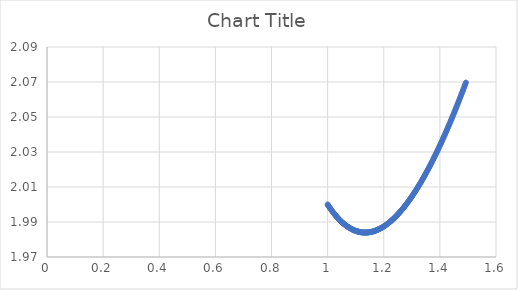
| Category | Series 0 |
|---|---|
| 1.0 | 2 |
| 1.0020008759583676 | 2 |
| 1.0040035076672138 | 1.999 |
| 1.0060079008777842 | 1.999 |
| 1.008014061342177 | 1.998 |
| 1.0100219948133655 | 1.998 |
| 1.0120317070452187 | 1.997 |
| 1.0140432037925207 | 1.997 |
| 1.016056490810993 | 1.996 |
| 1.018071573857315 | 1.996 |
| 1.020088458689142 | 1.995 |
| 1.0221071510651307 | 1.995 |
| 1.0241276567449544 | 1.995 |
| 1.0261499814893276 | 1.994 |
| 1.028174131060024 | 1.994 |
| 1.030200111219899 | 1.993 |
| 1.0322279277329087 | 1.993 |
| 1.0342575863641317 | 1.993 |
| 1.036289092879788 | 1.992 |
| 1.0383224530472612 | 1.992 |
| 1.0403576726351174 | 1.992 |
| 1.0423947574131265 | 1.991 |
| 1.0444337131522834 | 1.991 |
| 1.046474545624826 | 1.991 |
| 1.048517260604258 | 1.99 |
| 1.0505618638653689 | 1.99 |
| 1.052608361184252 | 1.99 |
| 1.0546567583383286 | 1.989 |
| 1.0567070611063651 | 1.989 |
| 1.058759275268495 | 1.989 |
| 1.0608134066062376 | 1.989 |
| 1.0628694609025209 | 1.988 |
| 1.0649274439417 | 1.988 |
| 1.0669873615095768 | 1.988 |
| 1.0690492193934225 | 1.988 |
| 1.0711130233819948 | 1.987 |
| 1.0731787792655616 | 1.987 |
| 1.0752464928359178 | 1.987 |
| 1.0773161698864087 | 1.987 |
| 1.0793878162119466 | 1.986 |
| 1.0814614376090346 | 1.986 |
| 1.083537039875784 | 1.986 |
| 1.0856146288119357 | 1.986 |
| 1.0876942102188798 | 1.986 |
| 1.0897757898996765 | 1.986 |
| 1.0918593736590754 | 1.985 |
| 1.0939449673035357 | 1.985 |
| 1.0960325766412462 | 1.985 |
| 1.0981222074821457 | 1.985 |
| 1.1002138656379428 | 1.985 |
| 1.1023075569221361 | 1.985 |
| 1.1044032871500338 | 1.985 |
| 1.1065010621387734 | 1.985 |
| 1.1086008877073432 | 1.985 |
| 1.1107027696766012 | 1.984 |
| 1.112806713869294 | 1.984 |
| 1.1149127261100789 | 1.984 |
| 1.117020812225542 | 1.984 |
| 1.1191309780442198 | 1.984 |
| 1.1212432293966175 | 1.984 |
| 1.1233575721152296 | 1.984 |
| 1.1254740120345597 | 1.984 |
| 1.1275925549911405 | 1.984 |
| 1.129713206823554 | 1.984 |
| 1.1318359733724501 | 1.984 |
| 1.133960860480567 | 1.984 |
| 1.1360878739927527 | 1.984 |
| 1.1382170197559816 | 1.984 |
| 1.1403483036193771 | 1.984 |
| 1.1424817314342297 | 1.984 |
| 1.1446173090540175 | 1.984 |
| 1.146755042334426 | 1.984 |
| 1.1488949371333672 | 1.984 |
| 1.151036999311 | 1.984 |
| 1.15318123472975 | 1.984 |
| 1.155327649254328 | 1.984 |
| 1.157476248751752 | 1.984 |
| 1.159627039091364 | 1.985 |
| 1.1617800261448519 | 1.985 |
| 1.1639352157862684 | 1.985 |
| 1.16609261389205 | 1.985 |
| 1.1682522263410384 | 1.985 |
| 1.1704140590144985 | 1.985 |
| 1.1725781177961385 | 1.985 |
| 1.17474440857213 | 1.985 |
| 1.1769129372311256 | 1.985 |
| 1.1790837096642823 | 1.986 |
| 1.1812567317652773 | 1.986 |
| 1.1834320094303297 | 1.986 |
| 1.1856095485582197 | 1.986 |
| 1.187789355050307 | 1.986 |
| 1.189971434810552 | 1.986 |
| 1.1921557937455345 | 1.987 |
| 1.1943424377644731 | 1.987 |
| 1.1965313727792453 | 1.987 |
| 1.1987226047044066 | 1.987 |
| 1.200916139457209 | 1.988 |
| 1.2031119829576227 | 1.988 |
| 1.2053101411283538 | 1.988 |
| 1.2075106198948646 | 1.988 |
| 1.209713425185393 | 1.989 |
| 1.211918562930971 | 1.989 |
| 1.2141260390654451 | 1.989 |
| 1.216335859525496 | 1.989 |
| 1.2185480302506573 | 1.99 |
| 1.2207625571833343 | 1.99 |
| 1.2229794462688257 | 1.99 |
| 1.2251987034553402 | 1.99 |
| 1.2274203346940182 | 1.991 |
| 1.2296443459389494 | 1.991 |
| 1.2318707431471934 | 1.991 |
| 1.2340995322787986 | 1.992 |
| 1.2363307192968218 | 1.992 |
| 1.2385643101673462 | 1.992 |
| 1.240800310859503 | 1.993 |
| 1.2430387273454893 | 1.993 |
| 1.2452795656005875 | 1.994 |
| 1.247522831603185 | 1.994 |
| 1.2497685313347928 | 1.994 |
| 1.2520166707800657 | 1.995 |
| 1.254267255926822 | 1.995 |
| 1.2565202927660604 | 1.995 |
| 1.2587757872919814 | 1.996 |
| 1.2610337455020069 | 1.996 |
| 1.2632941733967973 | 1.997 |
| 1.2655570769802733 | 1.997 |
| 1.2678224622596326 | 1.998 |
| 1.2700903352453714 | 1.998 |
| 1.272360701951302 | 1.999 |
| 1.2746335683945729 | 1.999 |
| 1.2769089405956884 | 1.999 |
| 1.2791868245785258 | 2 |
| 1.2814672263703577 | 2 |
| 1.283750152001868 | 2.001 |
| 1.286035607507173 | 2.001 |
| 1.2883235989238415 | 2.002 |
| 1.290614132292911 | 2.002 |
| 1.292907213658909 | 2.003 |
| 1.295202849069872 | 2.003 |
| 1.2975010445773643 | 2.004 |
| 1.299801806236497 | 2.004 |
| 1.302105140105948 | 2.005 |
| 1.3044110522479795 | 2.006 |
| 1.3067195487284586 | 2.006 |
| 1.309030635616877 | 2.007 |
| 1.3113443189863674 | 2.007 |
| 1.3136606049137254 | 2.008 |
| 1.3159794994794274 | 2.008 |
| 1.3183010087676497 | 2.009 |
| 1.3206251388662882 | 2.01 |
| 1.322951895866976 | 2.01 |
| 1.3252812858651053 | 2.011 |
| 1.327613314959843 | 2.011 |
| 1.3299479892541526 | 2.012 |
| 1.332285314854812 | 2.013 |
| 1.3346252978724331 | 2.013 |
| 1.3369679444214797 | 2.014 |
| 1.3393132606202882 | 2.015 |
| 1.3416612525910858 | 2.015 |
| 1.3440119264600094 | 2.016 |
| 1.3463652883571255 | 2.017 |
| 1.348721344416448 | 2.017 |
| 1.3510801007759579 | 2.018 |
| 1.3534415635776231 | 2.019 |
| 1.3558057389674156 | 2.019 |
| 1.3581726330953332 | 2.02 |
| 1.3605422521154154 | 2.021 |
| 1.362914602185764 | 2.022 |
| 1.365289689468564 | 2.022 |
| 1.3676675201300983 | 2.023 |
| 1.3700481003407703 | 2.024 |
| 1.3724314362751224 | 2.025 |
| 1.3748175341118531 | 2.025 |
| 1.377206400033838 | 2.026 |
| 1.3795980402281471 | 2.027 |
| 1.3819924608860663 | 2.028 |
| 1.3843896682031136 | 2.028 |
| 1.3867896683790597 | 2.029 |
| 1.3891924676179466 | 2.03 |
| 1.3915980721281067 | 2.031 |
| 1.3940064881221819 | 2.032 |
| 1.3964177218171416 | 2.032 |
| 1.3988317794343035 | 2.033 |
| 1.4012486671993505 | 2.034 |
| 1.4036683913423507 | 2.035 |
| 1.4060909580977776 | 2.036 |
| 1.4085163737045268 | 2.037 |
| 1.410944644405936 | 2.038 |
| 1.4133757764498036 | 2.038 |
| 1.4158097760884096 | 2.039 |
| 1.4182466495785306 | 2.04 |
| 1.4206864031814637 | 2.041 |
| 1.4231290431630403 | 2.042 |
| 1.4255745757936493 | 2.043 |
| 1.428023007348254 | 2.044 |
| 1.4304743441064116 | 2.045 |
| 1.4329285923522912 | 2.046 |
| 1.4353857583746938 | 2.046 |
| 1.4378458484670715 | 2.047 |
| 1.4403088689275452 | 2.048 |
| 1.4427748260589248 | 2.049 |
| 1.4452437261687268 | 2.05 |
| 1.4477155755691948 | 2.051 |
| 1.450190380577317 | 2.052 |
| 1.4526681475148462 | 2.053 |
| 1.455148882708318 | 2.054 |
| 1.4576325924890703 | 2.055 |
| 1.460119283193262 | 2.056 |
| 1.4626089611618909 | 2.057 |
| 1.465101632740815 | 2.058 |
| 1.4675973042807695 | 2.059 |
| 1.470095982137386 | 2.06 |
| 1.4725976726712124 | 2.061 |
| 1.4751023822477298 | 2.062 |
| 1.4776101172373746 | 2.063 |
| 1.4801208840155535 | 2.064 |
| 1.4826346889626663 | 2.065 |
| 1.4851515384641218 | 2.066 |
| 1.4876714389103596 | 2.068 |
| 1.4901943966968654 | 2.069 |
| 1.4927204182241924 | 2.07 |